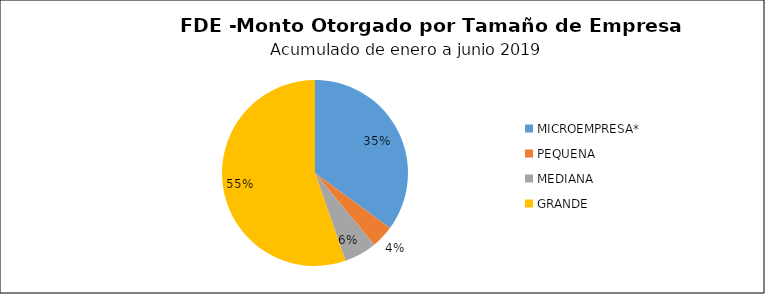
| Category | Monto | Créditos |
|---|---|---|
| MICROEMPRESA* | 2.283 | 124 |
| PEQUENA | 0.256 | 7 |
| MEDIANA | 0.369 | 3 |
| GRANDE | 3.6 | 2 |